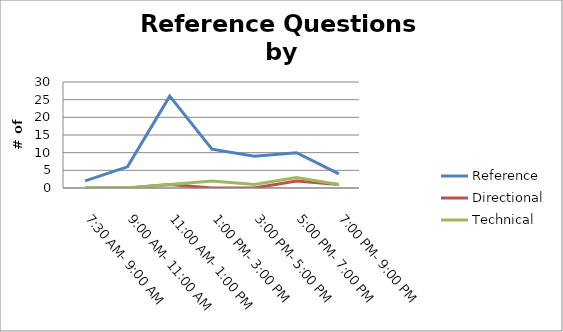
| Category | Reference | Directional | Technical |
|---|---|---|---|
| 7:30 AM- 9:00 AM | 2 | 0 | 0 |
| 9:00 AM- 11:00 AM | 6 | 0 | 0 |
| 11:00 AM- 1:00 PM | 26 | 1 | 1 |
| 1:00 PM- 3:00 PM | 11 | 0 | 2 |
| 3:00 PM- 5:00 PM | 9 | 0 | 1 |
| 5:00 PM- 7:00 PM | 10 | 2 | 3 |
| 7:00 PM- 9:00 PM | 4 | 1 | 1 |